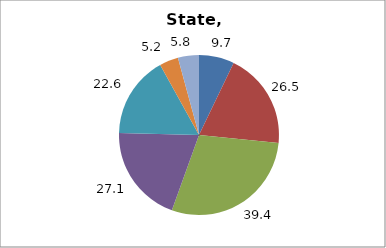
| Category | Series 0 |
|---|---|
| Higher Education | 9.713 |
| Elementary and Secondary Education | 26.5 |
| Total Education1 | 39.395 |
| Social Welfare2 | 27.073 |
| Transportation, Public Safety, Environment and Housing3 | 22.56 |
| Administration | 5.192 |
| Other4 | 5.781 |